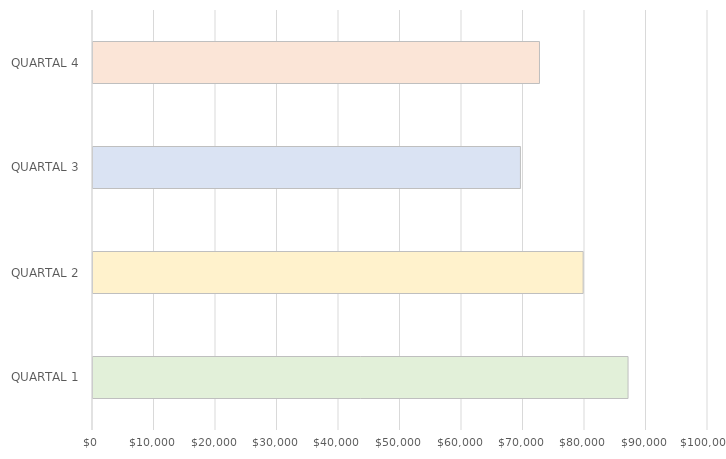
| Category | Series 0 |
|---|---|
| QUARTAL 1 | 87000 |
| QUARTAL 2 | 79700 |
| QUARTAL 3 | 69500 |
| QUARTAL 4 | 72600 |